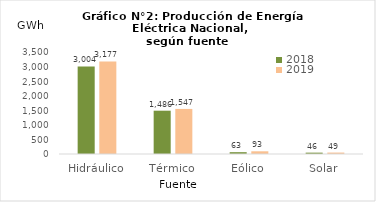
| Category | 2018 | 2019 |
|---|---|---|
| Hidráulico | 3003.682 | 3176.727 |
| Térmico | 1485.929 | 1546.852 |
| Eólico | 62.565 | 92.625 |
| Solar | 46.187 | 49.242 |